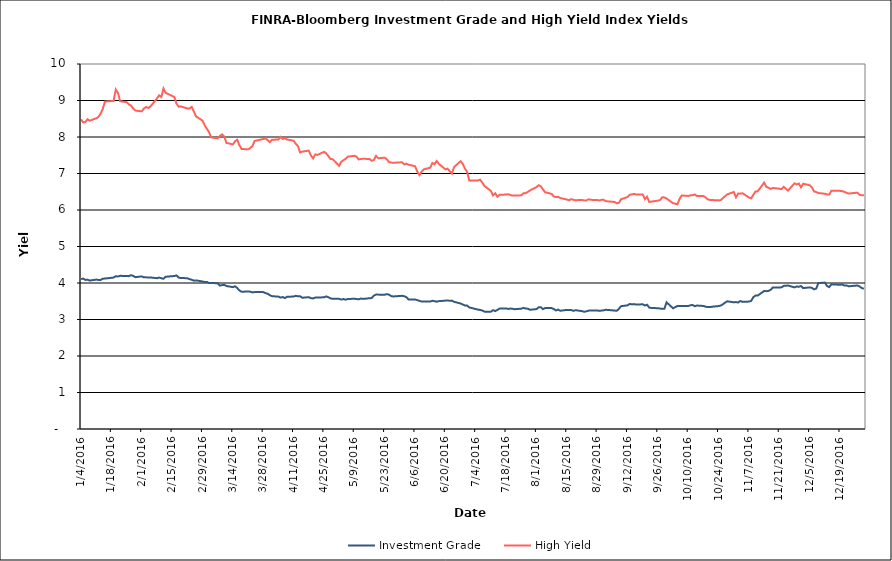
| Category | Investment Grade | High Yield |
|---|---|---|
| 1/4/16 | 4.106 | 8.484 |
| 1/5/16 | 4.12 | 8.399 |
| 1/6/16 | 4.084 | 8.412 |
| 1/7/16 | 4.09 | 8.486 |
| 1/8/16 | 4.067 | 8.446 |
| 1/11/16 | 4.093 | 8.512 |
| 1/12/16 | 4.085 | 8.549 |
| 1/13/16 | 4.082 | 8.64 |
| 1/14/16 | 4.118 | 8.769 |
| 1/15/16 | 4.122 | 8.973 |
| 1/19/16 | 4.149 | 8.988 |
| 1/20/16 | 4.186 | 9.301 |
| 1/21/16 | 4.177 | 9.211 |
| 1/22/16 | 4.196 | 8.98 |
| 1/25/16 | 4.194 | 8.955 |
| 1/26/16 | 4.187 | 8.894 |
| 1/27/16 | 4.214 | 8.863 |
| 1/28/16 | 4.196 | 8.783 |
| 1/29/16 | 4.16 | 8.725 |
| 2/1/16 | 4.182 | 8.703 |
| 2/2/16 | 4.154 | 8.78 |
| 2/3/16 | 4.156 | 8.825 |
| 2/4/16 | 4.15 | 8.793 |
| 2/5/16 | 4.151 | 8.837 |
| 2/8/16 | 4.131 | 9.058 |
| 2/9/16 | 4.149 | 9.143 |
| 2/10/16 | 4.131 | 9.094 |
| 2/11/16 | 4.116 | 9.329 |
| 2/12/16 | 4.171 | 9.21 |
| 2/16/16 | 4.192 | 9.095 |
| 2/17/16 | 4.208 | 8.915 |
| 2/18/16 | 4.15 | 8.831 |
| 2/19/16 | 4.138 | 8.84 |
| 2/22/16 | 4.13 | 8.781 |
| 2/23/16 | 4.106 | 8.783 |
| 2/24/16 | 4.09 | 8.824 |
| 2/25/16 | 4.064 | 8.702 |
| 2/26/16 | 4.072 | 8.564 |
| 2/29/16 | 4.042 | 8.449 |
| 3/1/16 | 4.025 | 8.321 |
| 3/2/16 | 4.029 | 8.227 |
| 3/3/16 | 3.997 | 8.131 |
| 3/4/16 | 4.002 | 7.988 |
| 3/7/16 | 3.992 | 7.96 |
| 3/8/16 | 3.928 | 8.028 |
| 3/9/16 | 3.943 | 8.071 |
| 3/10/16 | 3.949 | 8.015 |
| 3/11/16 | 3.918 | 7.839 |
| 3/14/16 | 3.887 | 7.796 |
| 3/15/16 | 3.911 | 7.883 |
| 3/16/16 | 3.862 | 7.924 |
| 3/17/16 | 3.796 | 7.778 |
| 3/18/16 | 3.762 | 7.673 |
| 3/21/16 | 3.765 | 7.661 |
| 3/22/16 | 3.763 | 7.696 |
| 3/23/16 | 3.743 | 7.751 |
| 3/24/16 | 3.75 | 7.891 |
| 3/28/16 | 3.751 | 7.945 |
| 3/29/16 | 3.724 | 7.962 |
| 3/30/16 | 3.707 | 7.915 |
| 3/31/16 | 3.668 | 7.857 |
| 4/1/16 | 3.64 | 7.924 |
| 4/4/16 | 3.626 | 7.932 |
| 4/5/16 | 3.6 | 8.003 |
| 4/6/16 | 3.616 | 7.948 |
| 4/7/16 | 3.587 | 7.964 |
| 4/8/16 | 3.623 | 7.931 |
| 4/11/16 | 3.629 | 7.898 |
| 4/12/16 | 3.648 | 7.816 |
| 4/13/16 | 3.636 | 7.75 |
| 4/14/16 | 3.636 | 7.578 |
| 4/15/16 | 3.596 | 7.599 |
| 4/18/16 | 3.611 | 7.627 |
| 4/19/16 | 3.584 | 7.493 |
| 4/20/16 | 3.577 | 7.413 |
| 4/21/16 | 3.601 | 7.525 |
| 4/22/16 | 3.602 | 7.509 |
| 4/25/16 | 3.608 | 7.592 |
| 4/26/16 | 3.633 | 7.556 |
| 4/27/16 | 3.611 | 7.481 |
| 4/28/16 | 3.58 | 7.395 |
| 4/29/16 | 3.567 | 7.393 |
| 5/2/16 | 3.567 | 7.211 |
| 5/3/16 | 3.545 | 7.322 |
| 5/4/16 | 3.56 | 7.364 |
| 5/5/16 | 3.542 | 7.403 |
| 5/6/16 | 3.562 | 7.461 |
| 5/9/16 | 3.568 | 7.485 |
| 5/10/16 | 3.562 | 7.463 |
| 5/11/16 | 3.554 | 7.385 |
| 5/12/16 | 3.575 | 7.4 |
| 5/13/16 | 3.564 | 7.402 |
| 5/16/16 | 3.583 | 7.399 |
| 5/17/16 | 3.587 | 7.35 |
| 5/18/16 | 3.653 | 7.369 |
| 5/19/16 | 3.683 | 7.483 |
| 5/20/16 | 3.682 | 7.418 |
| 5/23/16 | 3.68 | 7.433 |
| 5/24/16 | 3.695 | 7.39 |
| 5/25/16 | 3.68 | 7.313 |
| 5/26/16 | 3.641 | 7.301 |
| 5/27/16 | 3.632 | 7.293 |
| 5/31/16 | 3.649 | 7.308 |
| 6/1/16 | 3.638 | 7.247 |
| 6/2/16 | 3.613 | 7.269 |
| 6/3/16 | 3.549 | 7.242 |
| 6/6/16 | 3.55 | 7.2 |
| 6/7/16 | 3.53 | 7.058 |
| 6/8/16 | 3.512 | 6.957 |
| 6/9/16 | 3.494 | 7.046 |
| 6/10/16 | 3.491 | 7.112 |
| 6/13/16 | 3.493 | 7.16 |
| 6/14/16 | 3.513 | 7.288 |
| 6/15/16 | 3.501 | 7.256 |
| 6/16/16 | 3.489 | 7.342 |
| 6/17/16 | 3.503 | 7.262 |
| 6/20/16 | 3.518 | 7.114 |
| 6/21/16 | 3.523 | 7.133 |
| 6/22/16 | 3.512 | 7.061 |
| 6/23/16 | 3.517 | 7 |
| 6/24/16 | 3.486 | 7.176 |
| 6/27/16 | 3.438 | 7.337 |
| 6/28/16 | 3.412 | 7.263 |
| 6/29/16 | 3.384 | 7.135 |
| 6/30/16 | 3.381 | 7.047 |
| 7/1/16 | 3.331 | 6.811 |
| 7/5/16 | 3.272 | 6.808 |
| 7/6/16 | 3.262 | 6.83 |
| 7/7/16 | 3.248 | 6.752 |
| 7/8/16 | 3.215 | 6.66 |
| 7/11/16 | 3.215 | 6.521 |
| 7/12/16 | 3.256 | 6.4 |
| 7/13/16 | 3.231 | 6.458 |
| 7/14/16 | 3.264 | 6.364 |
| 7/15/16 | 3.299 | 6.415 |
| 7/18/16 | 3.303 | 6.424 |
| 7/19/16 | 3.289 | 6.431 |
| 7/20/16 | 3.3 | 6.411 |
| 7/21/16 | 3.295 | 6.394 |
| 7/22/16 | 3.282 | 6.4 |
| 7/25/16 | 3.297 | 6.401 |
| 7/26/16 | 3.318 | 6.458 |
| 7/27/16 | 3.3 | 6.461 |
| 7/28/16 | 3.296 | 6.496 |
| 7/29/16 | 3.266 | 6.535 |
| 8/1/16 | 3.285 | 6.628 |
| 8/2/16 | 3.334 | 6.681 |
| 8/3/16 | 3.338 | 6.65 |
| 8/4/16 | 3.284 | 6.56 |
| 8/5/16 | 3.315 | 6.486 |
| 8/8/16 | 3.313 | 6.441 |
| 8/9/16 | 3.287 | 6.367 |
| 8/10/16 | 3.248 | 6.354 |
| 8/11/16 | 3.271 | 6.362 |
| 8/12/16 | 3.24 | 6.326 |
| 8/15/16 | 3.263 | 6.288 |
| 8/16/16 | 3.259 | 6.267 |
| 8/17/16 | 3.26 | 6.296 |
| 8/18/16 | 3.236 | 6.28 |
| 8/19/16 | 3.255 | 6.268 |
| 8/22/16 | 3.229 | 6.276 |
| 8/23/16 | 3.212 | 6.264 |
| 8/24/16 | 3.224 | 6.263 |
| 8/25/16 | 3.242 | 6.293 |
| 8/26/16 | 3.249 | 6.278 |
| 8/29/16 | 3.246 | 6.274 |
| 8/30/16 | 3.239 | 6.262 |
| 8/31/16 | 3.244 | 6.278 |
| 9/1/16 | 3.252 | 6.279 |
| 9/2/16 | 3.266 | 6.241 |
| 9/6/16 | 3.246 | 6.22 |
| 9/7/16 | 3.238 | 6.185 |
| 9/8/16 | 3.291 | 6.196 |
| 9/9/16 | 3.365 | 6.294 |
| 9/12/16 | 3.388 | 6.355 |
| 9/13/16 | 3.427 | 6.416 |
| 9/14/16 | 3.414 | 6.429 |
| 9/15/16 | 3.422 | 6.44 |
| 9/16/16 | 3.409 | 6.426 |
| 9/19/16 | 3.417 | 6.426 |
| 9/20/16 | 3.383 | 6.298 |
| 9/21/16 | 3.405 | 6.361 |
| 9/22/16 | 3.327 | 6.222 |
| 9/23/16 | 3.316 | 6.23 |
| 9/26/16 | 3.309 | 6.256 |
| 9/27/16 | 3.3 | 6.274 |
| 9/28/16 | 3.291 | 6.349 |
| 9/29/16 | 3.297 | 6.344 |
| 9/30/16 | 3.47 | 6.314 |
| 10/3/16 | 3.307 | 6.186 |
| 10/4/16 | 3.338 | 6.172 |
| 10/5/16 | 3.37 | 6.154 |
| 10/6/16 | 3.371 | 6.309 |
| 10/7/16 | 3.368 | 6.399 |
| 10/10/16 | 3.369 | 6.385 |
| 10/11/16 | 3.391 | 6.401 |
| 10/12/16 | 3.397 | 6.403 |
| 10/13/16 | 3.364 | 6.426 |
| 10/14/16 | 3.382 | 6.386 |
| 10/17/16 | 3.371 | 6.38 |
| 10/18/16 | 3.352 | 6.345 |
| 10/19/16 | 3.339 | 6.292 |
| 10/20/16 | 3.341 | 6.274 |
| 10/21/16 | 3.351 | 6.273 |
| 10/24/16 | 3.368 | 6.263 |
| 10/25/16 | 3.382 | 6.272 |
| 10/26/16 | 3.418 | 6.329 |
| 10/27/16 | 3.463 | 6.38 |
| 10/28/16 | 3.499 | 6.43 |
| 10/31/16 | 3.471 | 6.493 |
| 11/1/16 | 3.478 | 6.347 |
| 11/2/16 | 3.466 | 6.45 |
| 11/3/16 | 3.506 | 6.448 |
| 11/4/16 | 3.483 | 6.46 |
| 11/7/16 | 3.491 | 6.343 |
| 11/8/16 | 3.509 | 6.318 |
| 11/9/16 | 3.612 | 6.416 |
| 11/10/16 | 3.655 | 6.507 |
| 11/11/16 | 3.654 | 6.513 |
| 11/14/16 | 3.782 | 6.752 |
| 11/15/16 | 3.776 | 6.634 |
| 11/16/16 | 3.783 | 6.612 |
| 11/17/16 | 3.813 | 6.576 |
| 11/18/16 | 3.876 | 6.604 |
| 11/21/16 | 3.878 | 6.584 |
| 11/22/16 | 3.88 | 6.572 |
| 11/23/16 | 3.921 | 6.634 |
| 11/25/16 | 3.93 | 6.532 |
| 11/28/16 | 3.88 | 6.731 |
| 11/29/16 | 3.905 | 6.701 |
| 11/30/16 | 3.894 | 6.726 |
| 12/1/16 | 3.919 | 6.619 |
| 12/2/16 | 3.86 | 6.72 |
| 12/5/16 | 3.88 | 6.678 |
| 12/6/16 | 3.867 | 6.622 |
| 12/7/16 | 3.826 | 6.51 |
| 12/8/16 | 3.847 | 6.491 |
| 12/9/16 | 3.998 | 6.465 |
| 12/12/16 | 4.011 | 6.445 |
| 12/13/16 | 3.917 | 6.427 |
| 12/14/16 | 3.889 | 6.421 |
| 12/15/16 | 3.963 | 6.527 |
| 12/16/16 | 3.961 | 6.529 |
| 12/19/16 | 3.951 | 6.524 |
| 12/20/16 | 3.96 | 6.515 |
| 12/21/16 | 3.93 | 6.498 |
| 12/22/16 | 3.93 | 6.47 |
| 12/23/16 | 3.91 | 6.451 |
| 12/27/16 | 3.932 | 6.475 |
| 12/28/16 | 3.906 | 6.417 |
| 12/29/16 | 3.861 | 6.401 |
| 12/30/16 | 3.844 | 6.409 |